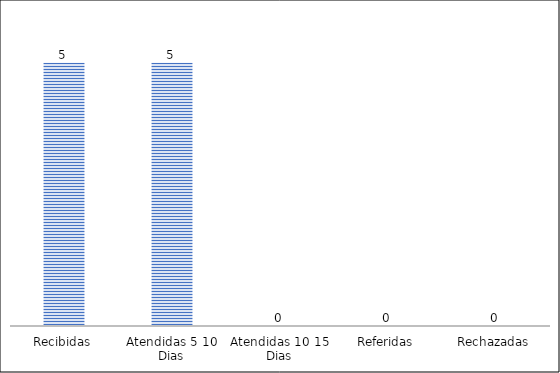
| Category | Series 0 | Series 4 |
|---|---|---|
| Recibidas | 5 |  |
| Atendidas 5 10 Dias | 5 |  |
| Atendidas 10 15 Dias | 0 |  |
| Referidas | 0 |  |
| Rechazadas | 0 |  |